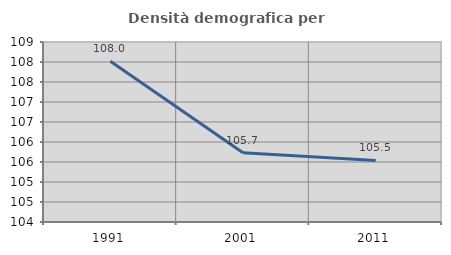
| Category | Densità demografica |
|---|---|
| 1991.0 | 108.02 |
| 2001.0 | 105.731 |
| 2011.0 | 105.54 |